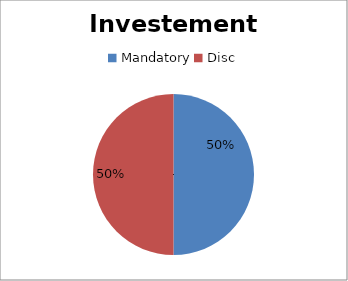
| Category | Series 0 |
|---|---|
| Mandatory | 1000 |
| Disc | 1000 |